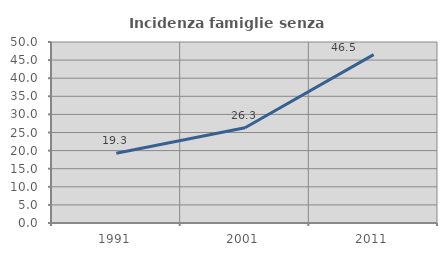
| Category | Incidenza famiglie senza nuclei |
|---|---|
| 1991.0 | 19.281 |
| 2001.0 | 26.312 |
| 2011.0 | 46.5 |